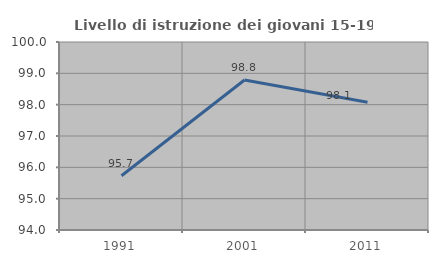
| Category | Livello di istruzione dei giovani 15-19 anni |
|---|---|
| 1991.0 | 95.732 |
| 2001.0 | 98.788 |
| 2011.0 | 98.077 |